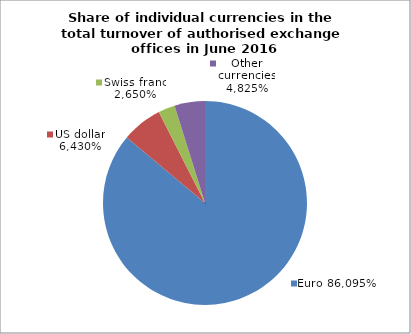
| Category | EUR |
|---|---|
| 0 | 0.861 |
| 1 | 0.064 |
| 2 | 0.026 |
| 3 | 0.048 |